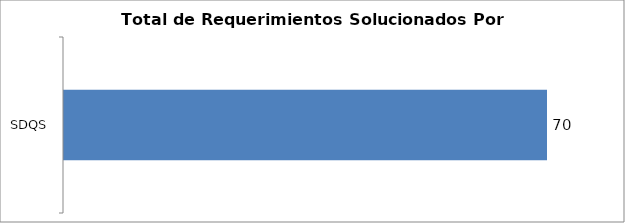
| Category | Total |
|---|---|
| SDQS | 70 |